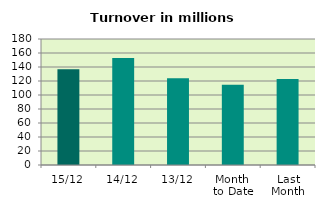
| Category | Series 0 |
|---|---|
| 15/12 | 136.753 |
| 14/12 | 152.997 |
| 13/12 | 124.065 |
| Month 
to Date | 114.501 |
| Last
Month | 122.873 |